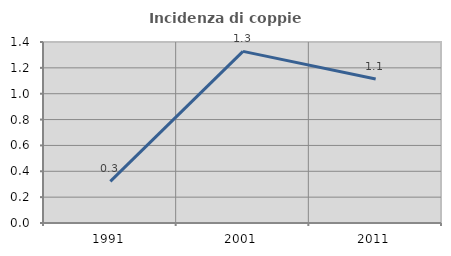
| Category | Incidenza di coppie miste |
|---|---|
| 1991.0 | 0.322 |
| 2001.0 | 1.327 |
| 2011.0 | 1.113 |